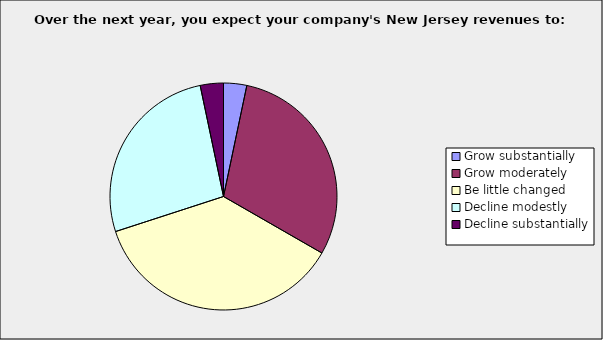
| Category | Series 0 |
|---|---|
| Grow substantially | 0.033 |
| Grow moderately | 0.3 |
| Be little changed | 0.367 |
| Decline modestly | 0.267 |
| Decline substantially | 0.033 |